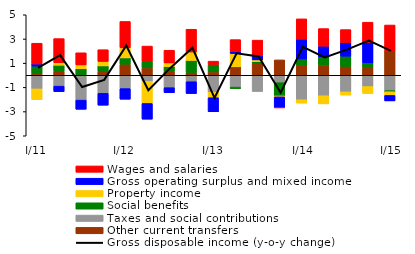
| Category | Other current transfers | Taxes and social contributions | Social benefits  | Property income | Gross operating surplus and mixed income  | Wages and salaries |
|---|---|---|---|---|---|---|
| I/11 | 0.12 | -1.127 | 0.636 | -0.884 | 0.18 | 1.716 |
| II | 0.333 | -0.898 | 0.5 | 0.207 | -0.451 | 1.991 |
| III | 0.028 | -2.052 | 0.509 | 0.319 | -0.758 | 1.002 |
| IV | 0.299 | -1.493 | 0.476 | 0.367 | -0.981 | 0.972 |
| I/12 | 0.917 | -1.102 | 0.519 | 0.831 | -0.878 | 2.18 |
| II | 0.612 | -0.51 | 0.51 | -1.821 | -1.297 | 1.291 |
| III | 0.335 | -1.025 | 0.386 | 0.3 | -0.415 | 1.049 |
| IV | 0.233 | -0.534 | 0.994 | 0.698 | -0.977 | 1.879 |
| I/13 | 0.279 | -1.401 | 0.618 | -0.454 | -1.165 | 0.271 |
| II | 0.7 | -0.979 | -0.129 | 1.101 | 0.152 | 0.994 |
| III | 0.967 | -1.339 | 0.154 | 0.152 | 0.335 | 1.298 |
|  IV | 1.272 | -0.614 | -1.095 | -0.075 | -0.882 | -0.023 |
|  I/14 | 0.813 | -2.023 | 0.529 | -0.279 | 1.637 | 1.685 |
| II | 0.853 | -1.693 | 0.659 | -0.671 | 0.896 | 1.45 |
| III | 0.739 | -1.371 | 0.839 | -0.266 | 1.128 | 1.07 |
| IV | 0.626 | -0.934 | 0.401 | -0.574 | 1.695 | 1.666 |
|  I/15 | 2.022 | -1.27 | -0.09 | -0.305 | -0.453 | 2.133 |